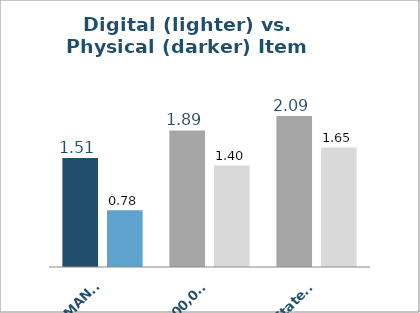
| Category | Physical | Digital |
|---|---|---|
| ALAMANCE | 1.507 | 0.784 |
| Average 100,000-249,999 population | 1.887 | 1.402 |
| Average Statewide | 2.087 | 1.652 |